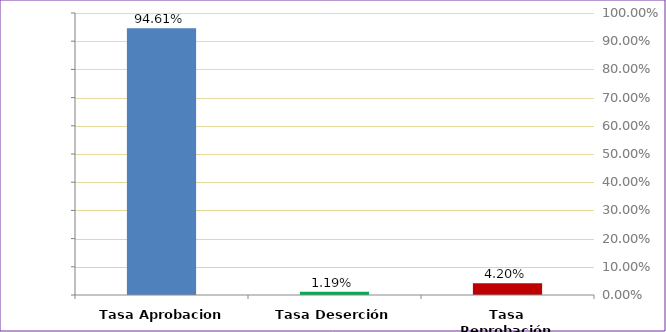
| Category | Total |
|---|---|
| Tasa Aprobacion | 0.946 |
| Tasa Deserción | 0.012 |
| Tasa Reprobación | 0.042 |